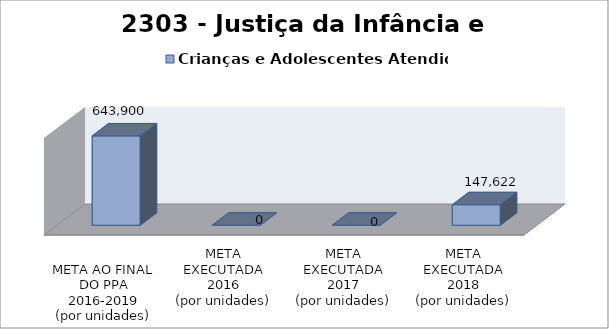
| Category | Crianças e Adolescentes Atendidos |
|---|---|
| 
META AO FINAL
DO PPA
2016-2019
(por unidades)
 | 643900 |
| META EXECUTADA
2016
(por unidades) | 0 |
| META EXECUTADA
2017
(por unidades) | 0 |
| META EXECUTADA
2018
(por unidades) | 147622 |